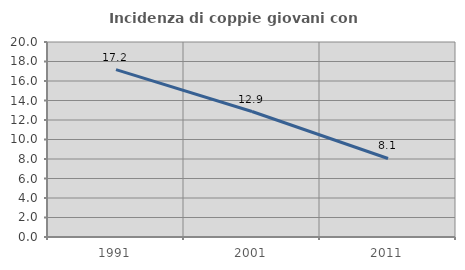
| Category | Incidenza di coppie giovani con figli |
|---|---|
| 1991.0 | 17.162 |
| 2001.0 | 12.871 |
| 2011.0 | 8.052 |